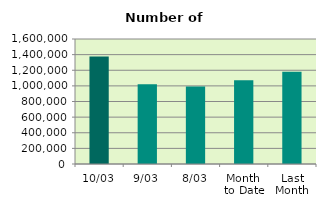
| Category | Series 0 |
|---|---|
| 10/03 | 1375630 |
| 9/03 | 1019920 |
| 8/03 | 991048 |
| Month 
to Date | 1071022.75 |
| Last
Month | 1180310.4 |